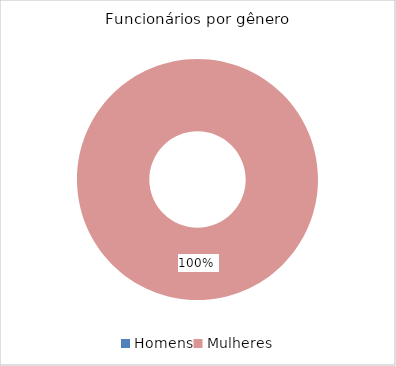
| Category | Total |
|---|---|
| Homens | 0 |
| Mulheres | 1 |